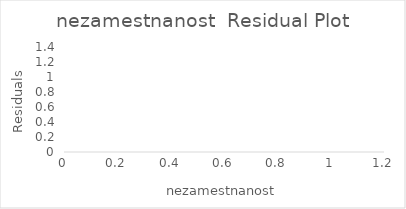
| Category | Series 0 |
|---|---|
|  | 1.267 |
|  | 15.292 |
|  | -0.004 |
|  | -4.838 |
|  | 8.461 |
|  | 0.406 |
|  | -7.557 |
|  | 0.977 |
|  | 6.416 |
|  | 2.316 |
|  | 5.403 |
|  | 12.918 |
|  | 1.216 |
|  | 5.071 |
|  | 3.928 |
|  | 4.869 |
|  | -1.017 |
|  | 4.699 |
|  | -2.366 |
|  | 8.168 |
|  | -16.393 |
|  | 6.189 |
|  | 11.513 |
|  | -1.577 |
|  | 5.841 |
|  | 10.309 |
|  | 4.587 |
|  | 3.82 |
|  | 0.775 |
|  | 11.954 |
|  | -0.415 |
|  | 9.138 |
|  | -8.422 |
|  | 1.537 |
|  | 3.233 |
|  | -6.567 |
|  | 12.716 |
|  | -0.663 |
|  | 1.883 |
|  | -1.22 |
|  | 11.537 |
|  | 7.772 |
|  | 6.327 |
|  | 0.132 |
|  | 1.859 |
|  | 5.192 |
|  | -4.631 |
|  | 7.261 |
|  | 4.036 |
|  | 13.141 |
|  | -6.839 |
|  | 4.633 |
|  | 7.245 |
|  | 1.591 |
|  | 9.561 |
|  | 3.293 |
|  | 12.322 |
|  | -13.358 |
|  | -17.142 |
|  | -2.834 |
|  | 0.723 |
|  | -2.875 |
|  | -4.661 |
|  | 3.18 |
|  | -6.265 |
|  | -3.186 |
|  | 4.661 |
|  | -0.001 |
|  | -7.832 |
|  | -10.403 |
|  | -12.019 |
|  | 1.246 |
|  | -6.517 |
|  | -7.326 |
|  | -0.567 |
|  | 8.21 |
|  | -2.295 |
|  | 1.416 |
|  | -4.326 |
|  | -4.394 |
|  | 14.023 |
|  | -7.789 |
|  | -3.364 |
|  | 7.16 |
|  | -2.409 |
|  | 6.465 |
|  | 0.104 |
|  | 11.134 |
|  | 1.918 |
|  | 4.078 |
|  | -0.038 |
|  | 2.564 |
|  | 4.352 |
|  | 0.917 |
|  | 2.778 |
|  | -14.236 |
|  | 18.317 |
|  | 2.247 |
|  | -8.331 |
|  | -1.928 |
|  | 0.414 |
|  | 2.132 |
|  | 1.234 |
|  | 9.922 |
|  | 3.246 |
|  | 7.458 |
|  | -2.226 |
|  | 2.223 |
|  | 7.795 |
|  | 1.67 |
|  | -1.227 |
|  | 4.144 |
|  | 1.067 |
|  | 11.906 |
|  | -0.938 |
|  | 1.544 |
|  | 7.12 |
|  | 8.609 |
|  | 16.017 |
|  | -0.301 |
|  | -2.303 |
|  | 7.436 |
|  | -3.164 |
|  | 1.28 |
|  | 9.504 |
|  | -1.574 |
|  | 2.381 |
|  | 5.739 |
|  | -1.544 |
|  | -3.916 |
|  | 7.122 |
|  | -1.678 |
|  | 4.717 |
|  | -3.603 |
|  | 4.063 |
|  | 0.999 |
|  | 2.267 |
|  | 3.226 |
|  | 14.044 |
|  | 3.478 |
|  | -1.733 |
|  | -6.796 |
|  | -7.289 |
|  | -13.458 |
|  | -0.716 |
|  | 11.555 |
|  | 0.811 |
|  | 5.932 |
|  | 0.497 |
|  | -16.441 |
|  | 0.358 |
|  | -13.357 |
|  | 1.688 |
|  | 1.413 |
|  | -0.325 |
|  | -8.941 |
|  | -8.586 |
|  | -6.393 |
|  | -4.65 |
|  | -8.179 |
|  | -10.448 |
|  | 13.044 |
|  | 2.15 |
|  | -12.631 |
|  | -2.582 |
|  | -5.523 |
|  | 2.437 |
|  | -24.268 |
|  | 2.312 |
|  | 8.082 |
|  | -1.626 |
|  | -9.087 |
|  | -5.973 |
|  | 4.233 |
|  | 1.584 |
|  | -4.84 |
|  | -8.852 |
|  | -3.49 |
|  | -11.352 |
|  | -8.272 |
|  | -2.824 |
|  | -5.022 |
|  | -4.91 |
|  | -7.19 |
|  | -0.995 |
|  | -3.77 |
|  | -18.173 |
|  | -17.444 |
|  | 3.859 |
|  | -8.69 |
|  | 8.133 |
|  | -7.523 |
|  | -1.373 |
|  | -7.237 |
|  | -8.995 |
|  | -0.254 |
|  | -12.089 |
|  | -3.835 |
|  | 5.587 |
|  | 7.764 |
|  | -3.925 |
|  | -9.523 |
|  | 1.077 |
|  | -11.612 |
|  | 3.916 |
|  | -0.586 |
|  | 1.692 |
|  | 1.985 |
|  | -4.164 |
|  | -23.99 |
|  | 1.307 |
|  | 1.648 |
|  | -0.232 |
|  | -5.542 |
|  | 2.662 |